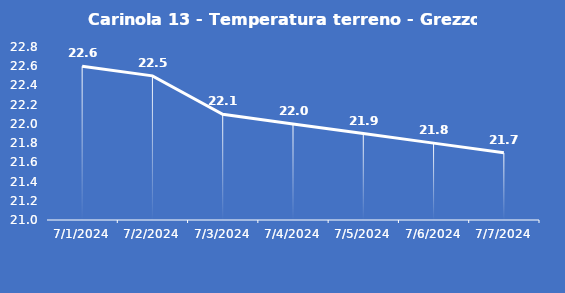
| Category | Carinola 13 - Temperatura terreno - Grezzo (°C) |
|---|---|
| 7/1/24 | 22.6 |
| 7/2/24 | 22.5 |
| 7/3/24 | 22.1 |
| 7/4/24 | 22 |
| 7/5/24 | 21.9 |
| 7/6/24 | 21.8 |
| 7/7/24 | 21.7 |